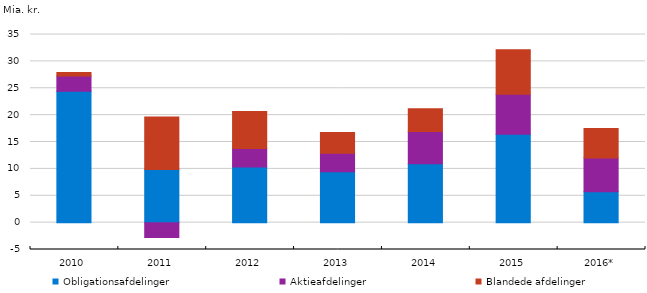
| Category | Obligationsafdelinger | Aktieafdelinger | Blandede afdelinger |
|---|---|---|---|
| 2010 | 24436442585.735 | 2825668483.384 | 656099803.35 |
| 2011 | 9905173293.912 | -2762249123.015 | 9723040047.828 |
| 2012 | 10352176426.416 | 3426439047.813 | 6884845867.757 |
| 2013 | 9469065147.711 | 3441669239.225 | 3836042208.166 |
| 2014 | 10944291526.521 | 6002045485.923 | 4258596930.986 |
| 2015 | 16455651980.358 | 7436333063.114 | 8264475766.222 |
| 2016* | 5734276958.365 | 6287567403.354 | 5507663620.851 |